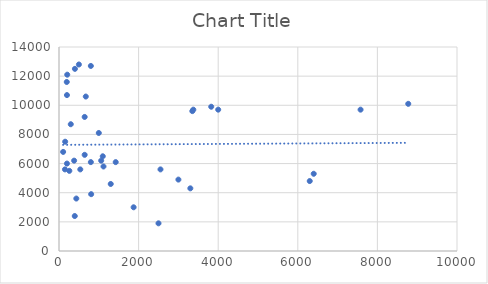
| Category | Series 0 |
|---|---|
| 260.0 | 5500 |
| 6400.0 | 5300 |
| 155.0 | 7500 |
| 4000.0 | 9700 |
| 3300.0 | 4300 |
| 200.0 | 6000 |
| 3825.0 | 9900 |
| 3375.0 | 9700 |
| 2550.0 | 5600 |
| 808.0 | 3900 |
| 7577.0 | 9700 |
| 6300.0 | 4800 |
| 150.0 | 5600 |
| 8775.0 | 10100 |
| 104.0 | 6800 |
| 645.0 | 9200 |
| 673.0 | 10600 |
| 1060.0 | 6200 |
| 400.0 | 12500 |
| 645.0 | 6600 |
| 500.0 | 12800 |
| 800.0 | 12700 |
| 535.0 | 5600 |
| 435.0 | 3600 |
| 1000.0 | 8100 |
| 1100.0 | 6500 |
| 396.0 | 2400 |
| 1300.0 | 4600 |
| 380.0 | 6200 |
| 3000.0 | 4900 |
| 296.0 | 8700 |
| 200.0 | 10700 |
| 207.0 | 12100 |
| 1875.0 | 3000 |
| 800.0 | 6100 |
| 195.0 | 11600 |
| 1118.0 | 5800 |
| 1425.0 | 6100 |
| 3350.0 | 9600 |
| 2500.0 | 1900 |